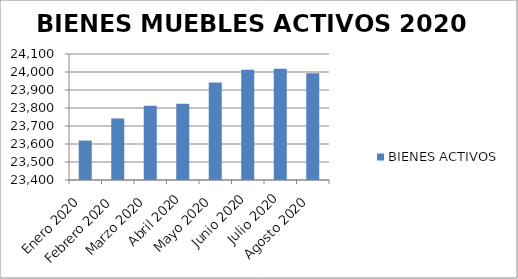
| Category | BIENES ACTIVOS |
|---|---|
| Enero 2020 | 23619 |
| Febrero 2020 | 23742 |
| Marzo 2020 | 23812 |
| Abril 2020 | 23824 |
| Mayo 2020 | 23942 |
| Junio 2020 | 24012 |
| Julio 2020 | 24018 |
| Agosto 2020 | 23993 |